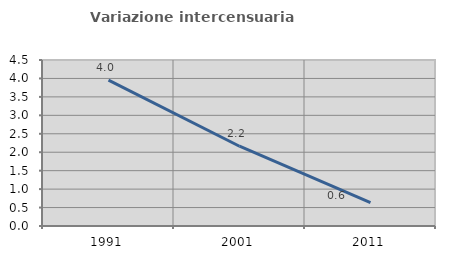
| Category | Variazione intercensuaria annua |
|---|---|
| 1991.0 | 3.955 |
| 2001.0 | 2.163 |
| 2011.0 | 0.635 |